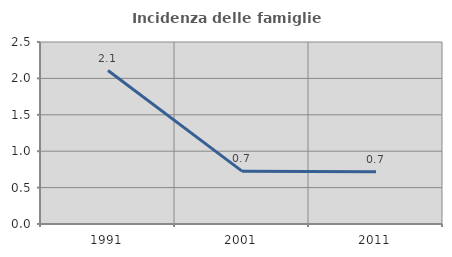
| Category | Incidenza delle famiglie numerose |
|---|---|
| 1991.0 | 2.108 |
| 2001.0 | 0.726 |
| 2011.0 | 0.719 |